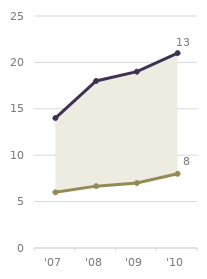
| Category | Bisc | choc-bisc |
|---|---|---|
| '07 | 6 | 8 |
| '08 | 6.667 | 11.333 |
| '09 | 7 | 12 |
| '10 | 8 | 13 |